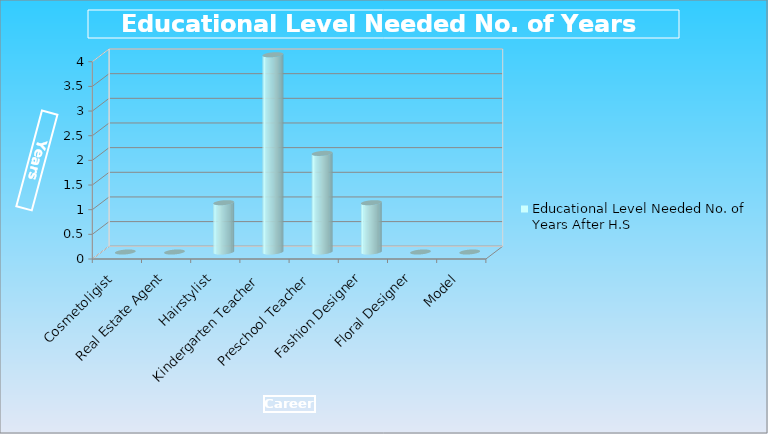
| Category | Educational Level Needed No. of Years After H.S |
|---|---|
| Cosmetoligist | 0 |
| Real Estate Agent | 0 |
| Hairstylist | 1 |
| Kindergarten Teacher | 4 |
| Preschool Teacher | 2 |
| Fashion Designer | 1 |
| Floral Designer | 0 |
| Model | 0 |